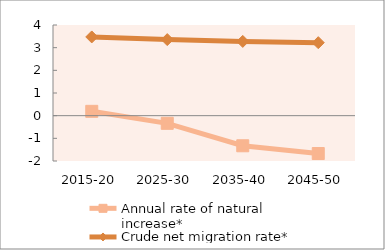
| Category | Annual rate of natural increase* | Crude net migration rate* |
|---|---|---|
| 2015-20 | 0.191 | 3.473 |
| 2025-30 | -0.338 | 3.356 |
| 2035-40 | -1.328 | 3.276 |
| 2045-50 | -1.67 | 3.22 |